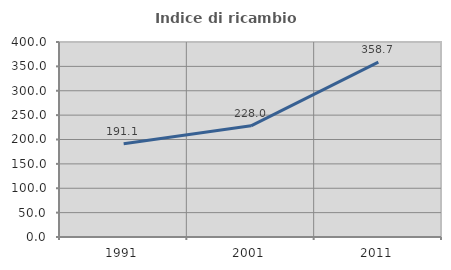
| Category | Indice di ricambio occupazionale  |
|---|---|
| 1991.0 | 191.129 |
| 2001.0 | 228.049 |
| 2011.0 | 358.73 |